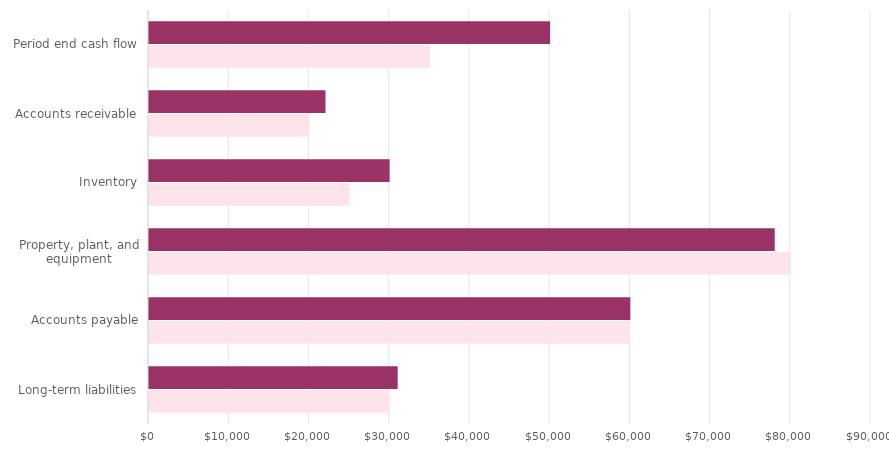
| Category | Series 0 | Series 1 |
|---|---|---|
| Long-term liabilities | 30000 | 31000 |
| Accounts payable | 60000 | 60000 |
| Property, plant, and equipment | 80000 | 78000 |
| Inventory | 25000 | 30000 |
| Accounts receivable | 20000 | 22000 |
| Period end cash flow | 35000 | 50000 |